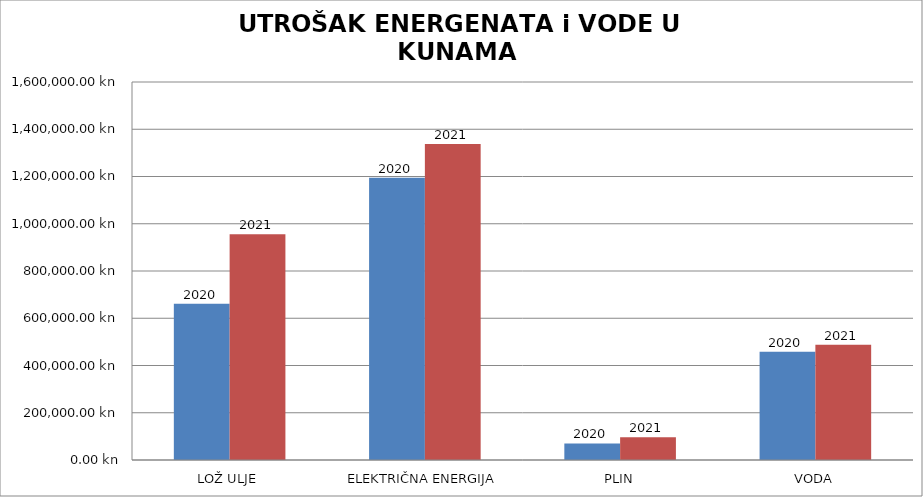
| Category | 2020 | 2021 |
|---|---|---|
| LOŽ ULJE | 661730.18 | 955874.33 |
| ELEKTRIČNA ENERGIJA | 1194876.94 | 1337431.45 |
| PLIN | 69944.57 | 96233.32 |
| VODA | 458343.58 | 487430.37 |